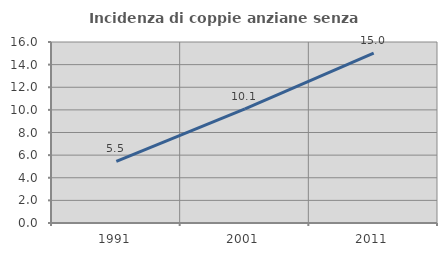
| Category | Incidenza di coppie anziane senza figli  |
|---|---|
| 1991.0 | 5.451 |
| 2001.0 | 10.08 |
| 2011.0 | 15.017 |